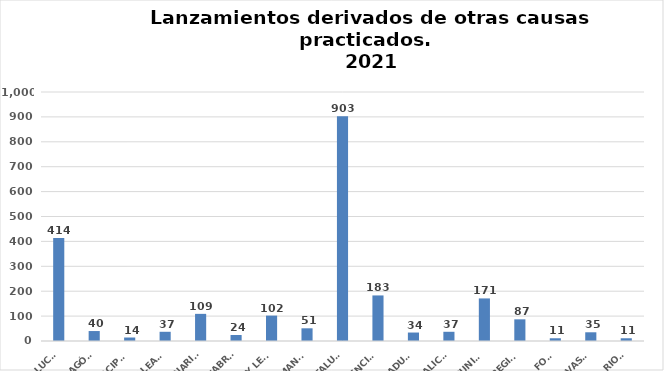
| Category | Series 0 |
|---|---|
| ANDALUCÍA | 414 |
| ARAGÓN | 40 |
| ASTURIAS, PRINCIPADO | 14 |
| ILLES BALEARS | 37 |
| CANARIAS | 109 |
| CANTABRIA | 24 |
| CASTILLA Y LEÓN | 102 |
| CASTILLA - LA MANCHA | 51 |
| CATALUÑA | 903 |
| COMUNITAT VALENCIANA | 183 |
| EXTREMADURA | 34 |
| GALICIA | 37 |
| MADRID, COMUNIDAD | 171 |
| MURCIA, REGIÓN | 87 |
| NAVARRA, COM. FORAL | 11 |
| PAÍS VASCO | 35 |
| LA RIOJA | 11 |